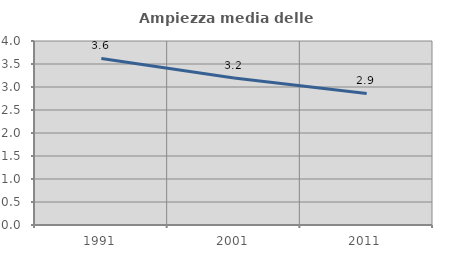
| Category | Ampiezza media delle famiglie |
|---|---|
| 1991.0 | 3.622 |
| 2001.0 | 3.194 |
| 2011.0 | 2.861 |